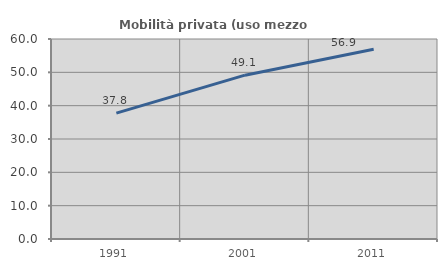
| Category | Mobilità privata (uso mezzo privato) |
|---|---|
| 1991.0 | 37.766 |
| 2001.0 | 49.145 |
| 2011.0 | 56.943 |